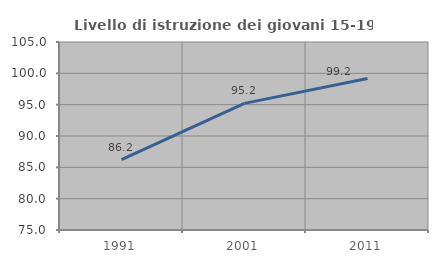
| Category | Livello di istruzione dei giovani 15-19 anni |
|---|---|
| 1991.0 | 86.224 |
| 2001.0 | 95.205 |
| 2011.0 | 99.175 |